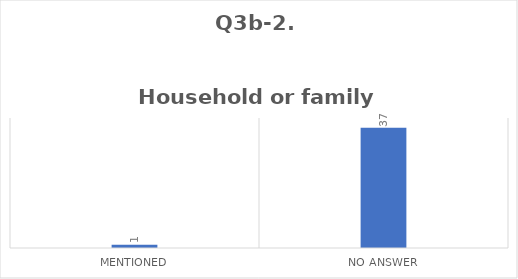
| Category | Q3b-2. 


Household or family duties |
|---|---|
| Mentioned | 1 |
| No Answer | 37 |